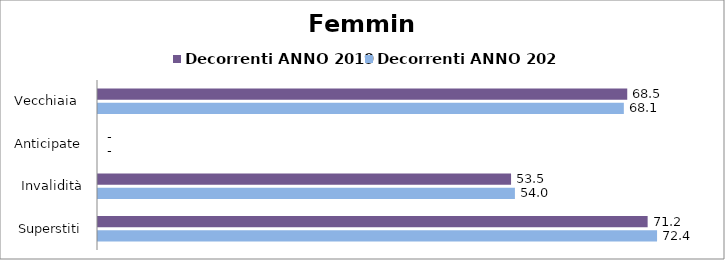
| Category | Decorrenti ANNO 2019 | Decorrenti ANNO 2020 |
|---|---|---|
| Vecchiaia  | 68.51 | 68.07 |
|  Anticipate | 0 | 0 |
| Invalidità | 53.47 | 53.97 |
| Superstiti | 71.15 | 72.37 |